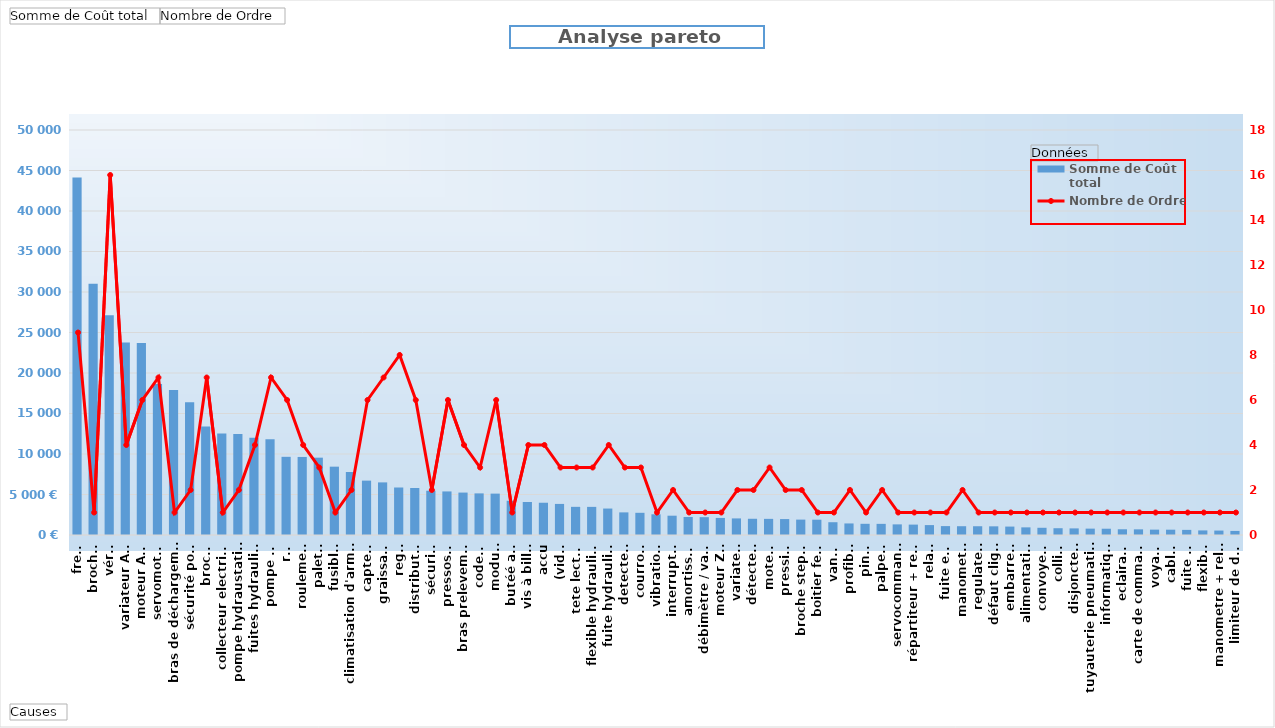
| Category | Somme de Coût total |
|---|---|
| frein | 44135 |
| broche  | 31031 |
| vérin | 27126 |
| variateur AMK | 23777 |
| moteur AMK | 23694 |
| servomoteur | 18633 |
| bras de déchargement | 17914 |
| sécurité porte | 16394 |
| broche | 13404 |
| collecteur electrique | 12544 |
| pompe hydraustatique | 12460 |
| fuites hydraulique | 12016 |
| pompe HP | 11835 |
| rail | 9652 |
| roulement | 9636 |
| palette | 9548 |
| fusible  | 8437 |
| climatisation d'armoire | 7778 |
| capteur | 6713 |
| graissage | 6495 |
| regle | 5864 |
| distributeur | 5802 |
| sécurité | 5465 |
| pressostat | 5379 |
| bras prelevement | 5237 |
| codeur | 5138 |
| module | 5109 |
| butéé axe | 4227 |
| vis à billes | 4076 |
| accu | 3983 |
| (vide) | 3837 |
| tete lecture | 3476 |
| flexible hydraulique | 3472 |
| fuite hydraulique | 3266 |
| detecteur | 2793 |
| courroie | 2740 |
| vibrations | 2554 |
| interrupteur | 2383 |
| amortisseur | 2227 |
| débimètre / vanne | 2201 |
| moteur ZL1 | 2107 |
| variateur | 2048 |
| détecteur | 2004 |
| moteur | 1993 |
| pression | 1967 |
| broche steptec | 1901 |
| boitier festo | 1889 |
| vanne | 1578 |
| profibus | 1426 |
| pince | 1382 |
| palpeur | 1376 |
| servocommande | 1312 |
| répartiteur + relais | 1283 |
| relais | 1223 |
| fuite eau | 1099 |
| manometre | 1085 |
| regulateur | 1082 |
| défaut cligno | 1070 |
| embarreur | 1040 |
| alimentation | 943 |
| convoyeur | 891 |
| collier | 838 |
| disjoncteur | 816 |
| tuyauterie pneumatique | 786 |
| informatique | 775 |
| eclairage | 708 |
| carte de commande | 699 |
| voyant | 662 |
| cables | 656 |
| fuite air | 632 |
| flexible | 566 |
| manometre + relais | 547 |
| limiteur de débit | 502 |